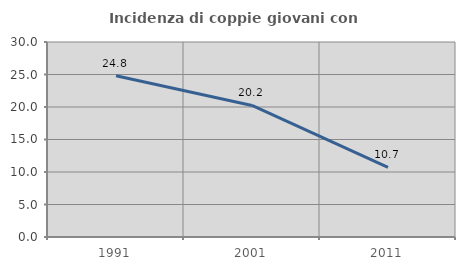
| Category | Incidenza di coppie giovani con figli |
|---|---|
| 1991.0 | 24.809 |
| 2001.0 | 20.234 |
| 2011.0 | 10.724 |